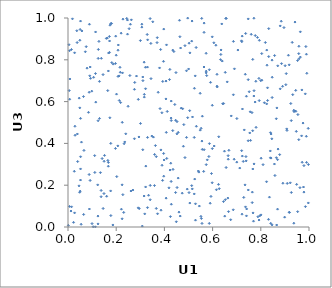
| Category | Series 0 |
|---|---|
| 0.9788830764701367 | 0.167 |
| 0.7382933071890104 | 0.337 |
| 0.922419389426752 | 0.211 |
| 0.5246746633130456 | 0.664 |
| 0.9009848426879103 | 0.772 |
| 0.13757059541510575 | 0.175 |
| 0.7861309197115104 | 0.907 |
| 0.8012970979670199 | 0.329 |
| 0.6066466531327434 | 0.388 |
| 0.7206055139371255 | 0.365 |
| 0.8918531277714573 | 0.209 |
| 0.9851581520181478 | 0.097 |
| 0.6503952192550411 | 0.052 |
| 0.39016531061259596 | 0.295 |
| 0.40634355737657857 | 0.613 |
| 0.8395344020329946 | 0.364 |
| 0.14166029385043155 | 0.327 |
| 0.9693484047753768 | 0.436 |
| 0.8329239313316334 | 0.949 |
| 0.6608357174120479 | 0.694 |
| 0.5238255741605297 | 0.429 |
| 0.9074897839846771 | 0.469 |
| 0.645327951556222 | 0.122 |
| 0.09363841455462474 | 0.711 |
| 0.22802641962514114 | 0.994 |
| 0.012447642685813554 | 0.076 |
| 0.2024713210498681 | 0.241 |
| 0.5914809882413423 | 0.692 |
| 0.35891170513379667 | 0.198 |
| 0.8716884901674705 | 0.373 |
| 0.18179256835252955 | 0.786 |
| 0.45722532153006346 | 0.234 |
| 0.04926195892515939 | 0.894 |
| 0.7479318064712766 | 0.996 |
| 0.5628640049237 | 0.266 |
| 0.0850969620247587 | 0.549 |
| 0.7006693236068876 | 0.519 |
| 0.16547356543540015 | 0.319 |
| 0.1978469605618598 | 0.913 |
| 0.5560725394042293 | 0.017 |
| 0.6528575206712514 | 0.131 |
| 0.0577415820642837 | 0.938 |
| 0.02618950449649926 | 0.267 |
| 0.06430454235327943 | 0.624 |
| 0.12521641857985966 | 0.807 |
| 0.39720550814002875 | 0.243 |
| 0.3004063152671168 | 0.892 |
| 0.7404438260157437 | 0.626 |
| 0.46039513637089746 | 0.071 |
| 0.05583095283742301 | 0.406 |
| 0.4966629162248133 | 0.523 |
| 0.6857580609108529 | 0.082 |
| 0.54073899095779 | 0.268 |
| 0.8328860955450558 | 0.815 |
| 0.3627456096981492 | 0.39 |
| 0.20757749254034075 | 0.846 |
| 0.1768780409662728 | 0.173 |
| 0.5647698343265182 | 0.37 |
| 0.9717300889171576 | 0.31 |
| 0.1878762427767955 | 0.779 |
| 0.3987734250324808 | 0.321 |
| 0.5735676920985348 | 0.298 |
| 0.2918097344787509 | 0.611 |
| 0.9086237270448997 | 0.462 |
| 0.99756643968055 | 0.299 |
| 0.10615950743816882 | 0.716 |
| 0.014698193202679843 | 0.097 |
| 0.11410745307937187 | 0.734 |
| 0.6862797325193554 | 0.633 |
| 0.409765797323961 | 0.328 |
| 0.7050050431588264 | 0.847 |
| 0.23964999315275015 | 0.446 |
| 0.7272797076878672 | 0.314 |
| 0.7477184067683503 | 0.705 |
| 0.40787600807414814 | 0.453 |
| 0.8904848594815173 | 0.673 |
| 0.8468103401479596 | 0.01 |
| 0.15158947626140984 | 0.343 |
| 0.564307607845407 | 0.765 |
| 0.8258029213869033 | 0.774 |
| 0.37993986850533745 | 0.761 |
| 0.51586220676476 | 0.182 |
| 0.06494751309574442 | 0.06 |
| 0.2769418660654832 | 0.691 |
| 0.8279613476488047 | 0.666 |
| 0.037958230017644534 | 0.882 |
| 0.45249228165181055 | 0.189 |
| 0.3215328176127893 | 0.764 |
| 0.9752978211261253 | 0.497 |
| 0.7995915645724786 | 0.7 |
| 0.20003465051286917 | 0.822 |
| 0.050472322563464456 | 0.172 |
| 0.9624332062783065 | 0.188 |
| 0.4644227741199425 | 0.911 |
| 0.3411798170687804 | 0.199 |
| 0.6341779589416399 | 0.826 |
| 0.39256466865036355 | 0.223 |
| 0.19718787627959644 | 0.782 |
| 0.3543116415377553 | 0.43 |
| 0.3168423477531854 | 0.635 |
| 0.6554537561566522 | 0.998 |
| 0.4759097856479214 | 0.566 |
| 0.788018936689581 | 0.049 |
| 0.6525291774734043 | 0.74 |
| 0.6182880074683472 | 0.731 |
| 0.7794856989981469 | 0.697 |
| 0.6137346590519028 | 0.87 |
| 0.5257013404951963 | 0.229 |
| 0.7667410620202002 | 0.278 |
| 0.036537463048250896 | 0.939 |
| 0.7519884673999923 | 0.647 |
| 0.006253275116668622 | 0.843 |
| 0.22462729882480748 | 0.039 |
| 0.7574993245875702 | 0.414 |
| 0.6052917720973204 | 0.881 |
| 0.359358484337032 | 0.347 |
| 0.937946357750658 | 0.552 |
| 0.663274372082392 | 0.138 |
| 0.4234886691871771 | 0.272 |
| 0.9577212795687228 | 0.418 |
| 0.25373326832232634 | 0.949 |
| 0.7212394964750922 | 0.887 |
| 0.9146967598435058 | 0.822 |
| 0.6561115781707576 | 0.998 |
| 0.04897341246033626 | 0.57 |
| 0.3228856144311917 | 0.291 |
| 0.8702857374086754 | 0.771 |
| 0.2245338575189153 | 0.202 |
| 0.814946428758561 | 0.595 |
| 0.5522748240611344 | 0.472 |
| 0.21207279755472952 | 0.723 |
| 0.0878533524828331 | 0.645 |
| 0.4918684270011062 | 0.429 |
| 0.3438220107121758 | 0.878 |
| 0.9909553667037516 | 0.735 |
| 0.9642075798607271 | 0.934 |
| 0.052092967386128564 | 0.278 |
| 0.8659688262326879 | 0.01 |
| 0.8473454626048769 | 0.717 |
| 0.8695974765367401 | 0.085 |
| 0.4189729619461101 | 0.187 |
| 0.5862513613899314 | 0.017 |
| 0.7764711677575098 | 0.598 |
| 0.13089056670775723 | 0.519 |
| 0.17174233751759416 | 0.912 |
| 0.24700931754333288 | 0.923 |
| 0.5239500575731835 | 0.158 |
| 0.7715454594392036 | 0.999 |
| 0.5049280016230397 | 0.556 |
| 0.48537794038931215 | 0.332 |
| 0.8094717363896623 | 0.298 |
| 0.9588225335184156 | 0.805 |
| 0.8413037372047407 | 0.018 |
| 0.14925801575140096 | 0.16 |
| 0.32201505896335925 | 0.192 |
| 0.3287276220706685 | 0.921 |
| 0.9575607454515153 | 0.829 |
| 0.028942802642488275 | 0.482 |
| 0.9486735641276742 | 0.204 |
| 0.9039630232722509 | 0.681 |
| 0.7346892622683334 | 0.202 |
| 0.11525992293871001 | 0.597 |
| 0.20876669203088627 | 0.871 |
| 0.14577898659285105 | 0.089 |
| 0.10448045750653112 | 0.001 |
| 0.11063017823287968 | 0.342 |
| 0.598904352510975 | 0.375 |
| 0.046534256561774456 | 0.617 |
| 0.43569323831768414 | 0.276 |
| 0.3304369704858645 | 0.895 |
| 0.5280730686701354 | 0.723 |
| 0.4392688701106644 | 0.84 |
| 0.5868263556539096 | 0.399 |
| 0.16494405635142362 | 0.653 |
| 0.7650191477155217 | 0.167 |
| 0.42502142216839933 | 0.05 |
| 0.20137354168486088 | 0.636 |
| 0.09217879022033748 | 0.766 |
| 0.2311375772875267 | 0.07 |
| 0.564848076367678 | 0.976 |
| 0.9418712209915094 | 0.981 |
| 0.3898238184745393 | 0.547 |
| 0.43469263399967883 | 0.461 |
| 0.344399637731275 | 0.71 |
| 0.9526292796924435 | 0.796 |
| 0.9582303029637308 | 0.865 |
| 0.13454905232939318 | 0.26 |
| 0.9899042573547616 | 0.309 |
| 0.4284094020128212 | 0.51 |
| 0.22054653497255694 | 0.927 |
| 0.2467759460425757 | 0.99 |
| 0.04580243187503619 | 0.197 |
| 0.9967554322299186 | 0.472 |
| 0.7696754126983404 | 0.028 |
| 0.7711898886860215 | 0.627 |
| 0.49487723718483123 | 0.181 |
| 0.5556890239525735 | 0.411 |
| 0.31084274522242383 | 0.7 |
| 0.5289327664910526 | 0.033 |
| 0.9302433048715683 | 0.883 |
| 0.16037425152207607 | 0.147 |
| 0.4071750474420016 | 0.138 |
| 0.5983778175819708 | 0.212 |
| 0.06614565831284269 | 0.366 |
| 0.12487502026103714 | 0.509 |
| 0.2954116916967424 | 0.088 |
| 0.050383479496209804 | 0.945 |
| 0.443094810235769 | 0.586 |
| 0.7412850686459859 | 0.086 |
| 0.57317628970844 | 0.831 |
| 0.7770699617502416 | 0.916 |
| 0.3715509850451689 | 0.063 |
| 0.004109447909577124 | 0.872 |
| 0.4740302208613534 | 0.162 |
| 0.006917259156896671 | 0.611 |
| 0.970324820137209 | 0.656 |
| 0.9368520280987591 | 0.559 |
| 0.36636135480245013 | 0.089 |
| 0.23560333707096248 | 0.407 |
| 0.038873171487743274 | 0.445 |
| 0.9871576912779718 | 0.863 |
| 0.14556890022457702 | 0.729 |
| 0.8696138619852614 | 0.322 |
| 0.005029340211640587 | 0.653 |
| 0.17766946025558372 | 0.973 |
| 0.5487017971106336 | 0.463 |
| 0.0889743558811622 | 0.97 |
| 0.05215404628095177 | 0.336 |
| 0.7663725204933971 | 0.46 |
| 0.9267203235396823 | 0.165 |
| 0.640000731731857 | 0.794 |
| 0.937086474164822 | 0.018 |
| 0.7392725490903436 | 0.316 |
| 0.8238301316289355 | 0.217 |
| 0.9264226385302766 | 0.509 |
| 0.9188516388722457 | 0.07 |
| 0.9325826518353123 | 0.633 |
| 0.6774510289119021 | 0.531 |
| 0.500386315313976 | 0.756 |
| 0.9096549176113312 | 0.209 |
| 0.5732542230182486 | 0.737 |
| 0.6276295128694394 | 0.183 |
| 0.7941175434423031 | 0.893 |
| 0.7356604698555738 | 0.731 |
| 0.5864771343540965 | 0.752 |
| 0.19695746489892996 | 0.376 |
| 0.8458771008491125 | 0.422 |
| 0.8045689596386693 | 0.702 |
| 0.2842288585420508 | 0.722 |
| 0.41180602647156983 | 0.553 |
| 0.7804707786292285 | 0.477 |
| 0.3696041021049229 | 0.882 |
| 0.5057710590017306 | 0.833 |
| 0.3158528646399652 | 0.148 |
| 0.8782560624427771 | 0.346 |
| 0.11346663151394198 | 0.001 |
| 0.8806544015044495 | 0.661 |
| 0.7198377164430155 | 0.891 |
| 0.15907422043943165 | 0.902 |
| 0.9529509824511145 | 0.073 |
| 0.5515238792398056 | 0.051 |
| 0.5954124800391235 | 0.256 |
| 0.42802819975690387 | 0.218 |
| 0.6160051383527008 | 0.178 |
| 0.763378258421728 | 0.547 |
| 0.9179026715155824 | 0.776 |
| 0.5148105389704084 | 0.985 |
| 0.3478964414410187 | 0.435 |
| 0.5326977484151305 | 0.482 |
| 0.26111336480962133 | 0.172 |
| 0.8861093169875923 | 0.782 |
| 0.3296961430154385 | 0.765 |
| 0.9847876221951813 | 0.637 |
| 0.5548248548260684 | 0.998 |
| 0.4464359980158378 | 0.165 |
| 0.08780951576311835 | 0.251 |
| 0.3083939626663832 | 0.004 |
| 0.3663129659429071 | 0.337 |
| 0.9972631809582544 | 0.115 |
| 0.4466419541183815 | 0.511 |
| 0.1684909965561885 | 0.832 |
| 0.8566640994979111 | 0.301 |
| 0.7642651151228755 | 0.117 |
| 0.531691081643324 | 0.859 |
| 0.3065060827660486 | 0.956 |
| 0.7477738161823179 | 0.413 |
| 0.7934166982831142 | 0.605 |
| 0.553547765281652 | 0.041 |
| 0.4278098655829041 | 0.521 |
| 0.8849297527715001 | 0.985 |
| 0.6661837981214132 | 0.074 |
| 0.5290186694659768 | 0.111 |
| 0.29439866326827213 | 0.431 |
| 0.5986835769145513 | 0.91 |
| 0.7719875756107286 | 0.652 |
| 0.7228236875297045 | 0.913 |
| 0.6645133373027232 | 0.341 |
| 0.48070693591810887 | 0.49 |
| 0.7541948252287335 | 0.45 |
| 0.3301319412602688 | 0.429 |
| 0.8402377162706207 | 0.451 |
| 0.7921894760078803 | 0.711 |
| 0.2757566347520435 | 0.422 |
| 0.31027629003296997 | 0.37 |
| 0.4212212560046854 | 0.706 |
| 0.1143334673801718 | 0.933 |
| 0.17233875627389206 | 0.89 |
| 0.6193290229466867 | 0.67 |
| 0.7366363539746595 | 0.096 |
| 0.575469492237129 | 0.724 |
| 0.7678769336042989 | 0.067 |
| 0.8398850668602286 | 0.331 |
| 0.4852965210839869 | 0.868 |
| 0.17376192049074646 | 0.523 |
| 0.5053988810875789 | 0.115 |
| 0.4263673104515042 | 0.305 |
| 0.007823327640482658 | 0.708 |
| 0.13737833234332952 | 0.145 |
| 0.667684180320692 | 0.367 |
| 0.04015463097354466 | 0.313 |
| 0.30651133772923245 | 0.97 |
| 0.17753456255719757 | 0.4 |
| 0.24381492910116354 | 0.998 |
| 0.8242586995053112 | 0.589 |
| 0.723412219200501 | 0.339 |
| 0.3821229997134661 | 0.567 |
| 0.1631448812109042 | 0.904 |
| 0.39631185523884627 | 0.793 |
| 0.18075463994690277 | 0.974 |
| 0.5931754705047153 | 0.146 |
| 0.12423195920209795 | 0.052 |
| 0.49172476106052365 | 0.748 |
| 0.5484412193671911 | 0.64 |
| 0.09182984703702146 | 0.223 |
| 0.08892800346631058 | 0.086 |
| 0.8281856213084362 | 0.605 |
| 0.2915295262835558 | 0.092 |
| 0.9772068808031642 | 0.191 |
| 0.21559700414266036 | 0.764 |
| 0.502351822322706 | 0.165 |
| 0.07191384867572281 | 0.838 |
| 0.38595793823487723 | 0.08 |
| 0.792665979536697 | 0.033 |
| 0.38549761357664314 | 0.369 |
| 0.5900748095456548 | 0.114 |
| 0.3407161734742328 | 0.997 |
| 0.3843988963336886 | 0.849 |
| 0.25680805195516443 | 0.725 |
| 0.46563887532018344 | 0.052 |
| 0.6245083715584872 | 0.204 |
| 0.8646196681046784 | 0.332 |
| 0.5024496204420347 | 0.88 |
| 0.316752246470688 | 0.622 |
| 0.6255600722163915 | 0.432 |
| 0.7316497065680242 | 0.464 |
| 0.6649672008802103 | 0.324 |
| 0.8588355944336484 | 0.246 |
| 0.5572294760222466 | 0.371 |
| 0.4573297259598823 | 0.453 |
| 0.5131972092283129 | 0.889 |
| 0.45193254883975265 | 0.446 |
| 0.4283630045737371 | 0.603 |
| 0.7560681429229573 | 0.551 |
| 0.9889733060216763 | 0.434 |
| 0.12313709526893302 | 0.202 |
| 0.8470897162842106 | 0.619 |
| 0.5781451219719983 | 0.321 |
| 0.12836368920481533 | 0.888 |
| 0.7371810994304477 | 0.926 |
| 0.3742575874905646 | 0.645 |
| 0.428795133268532 | 0.109 |
| 0.32993938410859525 | 0.093 |
| 0.9055769015520542 | 0.734 |
| 0.7293479446973019 | 0.141 |
| 0.2757267602149327 | 0.659 |
| 0.8038946744654075 | 0.83 |
| 0.8806453097506495 | 0.962 |
| 0.21265791482867347 | 0.605 |
| 0.07912786639251623 | 0.76 |
| 0.05201610642999832 | 0.985 |
| 0.7666612784485285 | 0.802 |
| 0.3009032232409853 | 0.495 |
| 0.7602370979009195 | 0.922 |
| 0.947391823448269 | 0.458 |
| 0.8422851197789122 | 0.33 |
| 0.6351602848802358 | 0.847 |
| 0.39724777124640387 | 0.947 |
| 0.37045326955100566 | 0.906 |
| 0.7126329371993323 | 0.282 |
| 0.7404811365912543 | 0.053 |
| 0.23294110062038442 | 0.398 |
| 0.564626553164157 | 0.931 |
| 0.5430287493675023 | 0.263 |
| 0.40878875351254007 | 0.871 |
| 0.44805347757581504 | 0.739 |
| 0.6457250414392742 | 0.591 |
| 0.22604805640612602 | 0.737 |
| 0.3931239537590445 | 0.696 |
| 0.3341964212503863 | 0.152 |
| 0.9893091161640917 | 0.827 |
| 0.8666593694349821 | 0.57 |
| 0.7004010820543147 | 0.31 |
| 0.49663417063649384 | 0.999 |
| 0.01841617890409608 | 0.996 |
| 0.5133085164078875 | 0.198 |
| 0.3518285371276333 | 0.982 |
| 0.0291833724494569 | 0.439 |
| 0.052092796740600855 | 0.52 |
| 0.6894931477910153 | 0.324 |
| 0.6751074933064569 | 0.035 |
| 0.40679554847164534 | 0.698 |
| 0.8007122828803034 | 0.058 |
| 0.027317261538046034 | 0.833 |
| 0.2493422907192957 | 0.578 |
| 0.618053841987043 | 0.674 |
| 0.979017132807881 | 0.294 |
| 0.8989385498530797 | 0.047 |
| 0.5846711615846395 | 0.337 |
| 0.31594012360252066 | 0.789 |
| 0.42271512048331383 | 0.754 |
| 0.16738027817912338 | 0.291 |
| 0.216863587233164 | 0.74 |
| 0.6561142486820779 | 0.285 |
| 0.6329674835873351 | 0.801 |
| 0.8320606970423614 | 0.037 |
| 0.8643005827030631 | 0.518 |
| 0.16753724922087232 | 0.747 |
| 0.20778541664131245 | 0.721 |
| 0.9179054163250285 | 0.07 |
| 0.1259278965538737 | 0.85 |
| 0.17197922312785519 | 0.836 |
| 0.09025318550865147 | 0.723 |
| 0.9419421135515267 | 0.555 |
| 0.7221692548403635 | 0.061 |
| 0.6380937768344286 | 0.972 |
| 0.17426172311854227 | 0.966 |
| 0.7239720740500679 | 0.565 |
| 0.5166135165350463 | 0.526 |
| 0.857270396458447 | 0.82 |
| 0.9641436703483158 | 0.813 |
| 0.26293832170321607 | 0.991 |
| 0.13842592294257738 | 0.807 |
| 0.46263196972920506 | 0.989 |
| 0.09982484685219295 | 0.016 |
| 0.0987221755435268 | 0.65 |
| 0.4347814305993619 | 0.846 |
| 0.14975864607064393 | 0.314 |
| 0.8357945000373552 | 0.143 |
| 0.6491909628784247 | 0.363 |
| 0.7481163871379161 | 0.177 |
| 0.006192987699404684 | 0.098 |
| 0.2693323041920975 | 0.177 |
| 0.9244026976190725 | 0.591 |
| 0.11132448594179623 | 0.261 |
| 0.4788971016994791 | 0.386 |
| 0.34103048361607546 | 0.13 |
| 0.9449423365913078 | 0.654 |
| 0.31837279066202484 | 0.063 |
| 0.5733618157227761 | 0.746 |
| 0.2276777957186562 | 0.155 |
| 0.4671795879343652 | 0.856 |
| 0.2182989966061113 | 0.595 |
| 0.05451301634560968 | 0.013 |
| 0.8960594548471664 | 0.954 |
| 0.023092322202881377 | 0.022 |
| 0.027410364247804964 | 0.068 |
| 0.5574634525932739 | 0.53 |
| 0.001509781514464792 | 0.008 |
| 0.13068929027479537 | 0.697 |
| 0.39681687281073263 | 0.352 |
| 0.12462836787014508 | 0.015 |
| 0.8427653445063785 | 0.445 |
| 0.32173200621948306 | 0.662 |
| 0.9539720755116264 | 0.538 |
| 0.5450947273228095 | 0.1 |
| 0.186153349431737 | 0.01 |
| 0.22515592146832164 | 0.501 |
| 0.25902595019841457 | 0.97 |
| 0.206875307986631 | 0.388 |
| 0.8247522033012041 | 0.846 |
| 0.4494833710715156 | 0.025 |
| 0.6419202816945627 | 0.59 |
| 0.0518865378271981 | 0.225 |
| 0.31025410747770643 | 0.718 |
| 0.048256217406726476 | 0.166 |
| 0.6863535249325381 | 0.888 |
| 0.16761291137535328 | 0.309 |
| 0.7719476601077513 | 0.302 |
| 0.014428152623863544 | 0.849 |
| 0.4697107870352162 | 0.569 |
| 0.9454814635045503 | 0.554 |
| 0.8189015005848419 | 0.883 |
| 0.8468422296507155 | 0.798 |
| 0.17783483322061533 | 0.055 |
| 0.07550036446042074 | 0.863 |
| 0.7960743853632728 | 0.054 |
| 0.4524383878741678 | 0.504 |
| 0.598713424588138 | 0.582 |
| 0.6905978986226882 | 0.757 |
| 0.22163966233922183 | 0.085 |